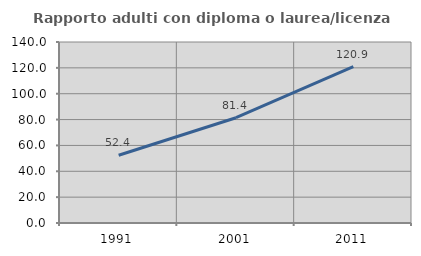
| Category | Rapporto adulti con diploma o laurea/licenza media  |
|---|---|
| 1991.0 | 52.381 |
| 2001.0 | 81.439 |
| 2011.0 | 120.93 |